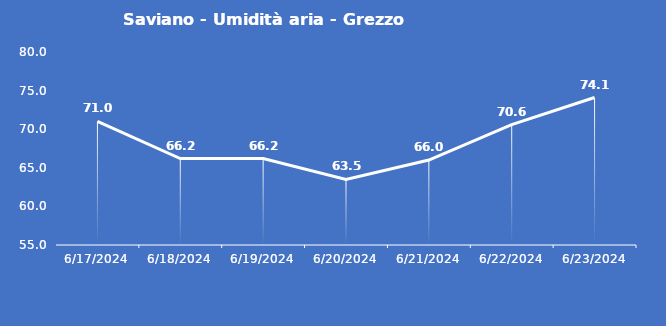
| Category | Saviano - Umidità aria - Grezzo (%) |
|---|---|
| 6/17/24 | 71 |
| 6/18/24 | 66.2 |
| 6/19/24 | 66.2 |
| 6/20/24 | 63.5 |
| 6/21/24 | 66 |
| 6/22/24 | 70.6 |
| 6/23/24 | 74.1 |